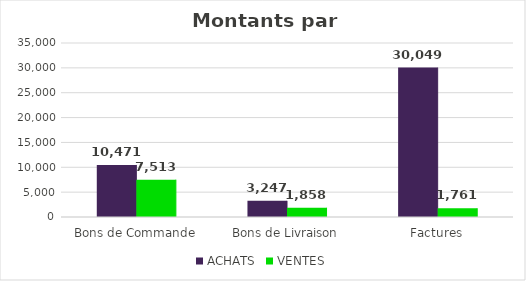
| Category | ACHATS | VENTES |
|---|---|---|
| Bons de Commande | 10471 | 7513.12 |
| Bons de Livraison | 3247.2 | 1857.92 |
| Factures | 30049.16 | 1760.88 |